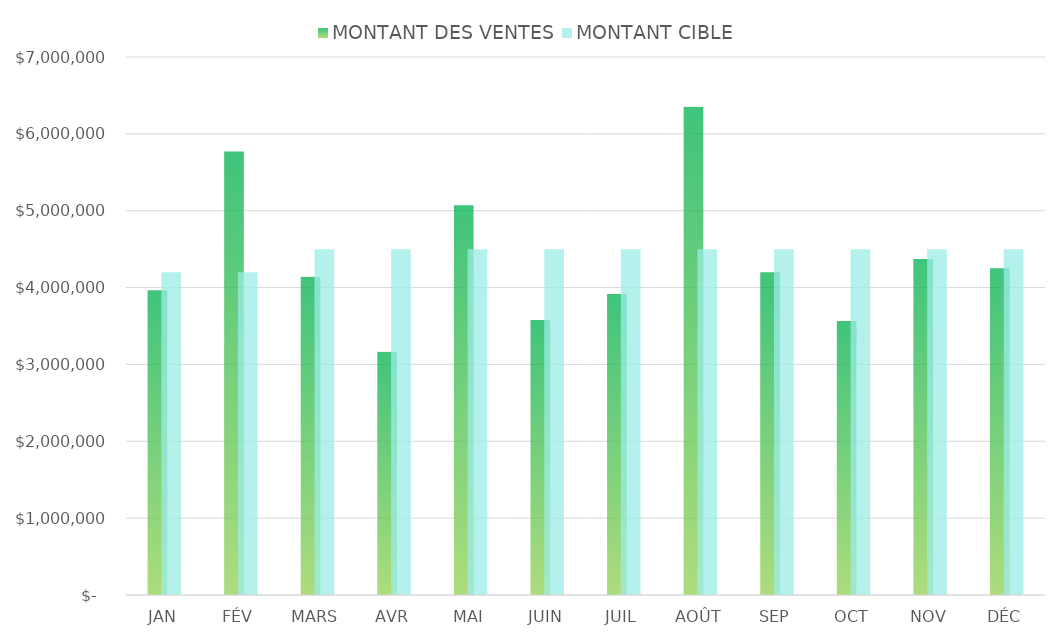
| Category | MONTANT DES VENTES | MONTANT CIBLE |
|---|---|---|
| JAN | 3964785 | 4200000 |
| FÉV | 5772041 | 4200000 |
| MARS | 4139699 | 4500000 |
| AVR | 3166287 | 4500000 |
| MAI | 5072530 | 4500000 |
| JUIN | 3577330 | 4500000 |
| JUIL | 3916803 | 4500000 |
| AOÛT | 6352355 | 4500000 |
| SEP | 4198802 | 4500000 |
| OCT | 3563537 | 4500000 |
| NOV | 4373343 | 4500000 |
| DÉC | 4250199 | 4500000 |